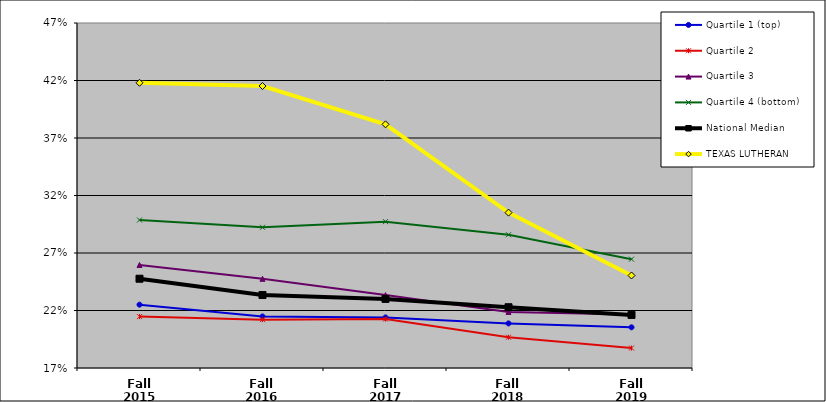
| Category | Quartile 1 (top) | Quartile 2 | Quartile 3 | Quartile 4 (bottom) | National Median | TEXAS LUTHERAN |
|---|---|---|---|---|---|---|
| Fall 2015 | 0.225 | 0.215 | 0.26 | 0.299 | 0.248 | 0.418 |
| Fall 2016 | 0.215 | 0.212 | 0.248 | 0.292 | 0.233 | 0.415 |
| Fall 2017 | 0.214 | 0.213 | 0.233 | 0.297 | 0.23 | 0.382 |
| Fall 2018 | 0.209 | 0.197 | 0.219 | 0.286 | 0.223 | 0.305 |
| Fall 2019 | 0.205 | 0.187 | 0.217 | 0.265 | 0.216 | 0.25 |